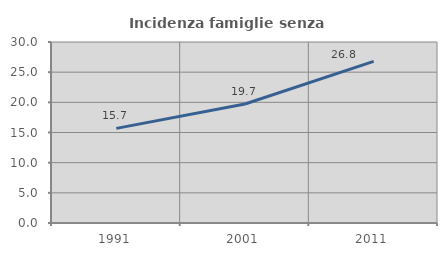
| Category | Incidenza famiglie senza nuclei |
|---|---|
| 1991.0 | 15.681 |
| 2001.0 | 19.723 |
| 2011.0 | 26.79 |